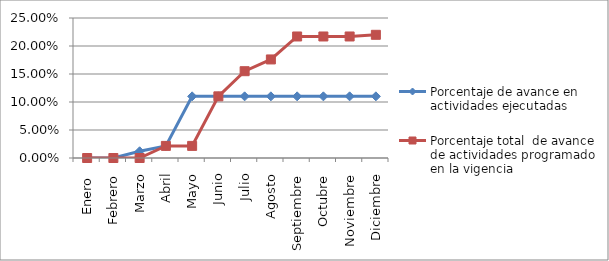
| Category | Porcentaje de avance en actividades ejecutadas | Porcentaje total  de avance de actividades programado en la vigencia |
|---|---|---|
| Enero  | 0 | 0 |
| Febrero | 0 | 0 |
| Marzo | 0.012 | 0 |
| Abril | 0.022 | 0.022 |
| Mayo | 0.11 | 0.022 |
| Junio | 0.11 | 0.11 |
| Julio | 0.11 | 0.155 |
| Agosto | 0.11 | 0.176 |
| Septiembre | 0.11 | 0.217 |
| Octubre | 0.11 | 0.217 |
| Noviembre | 0.11 | 0.217 |
| Diciembre | 0.11 | 0.22 |